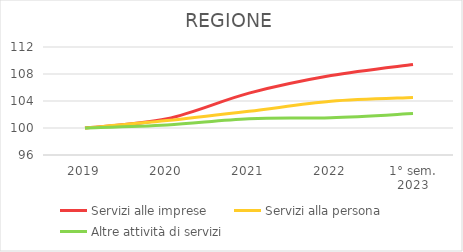
| Category | Servizi alle imprese | Servizi alla persona | Altre attività di servizi |
|---|---|---|---|
| 2019 | 100 | 100 | 100 |
| 2020 | 101.369 | 101.095 | 100.456 |
| 2021 | 105.169 | 102.473 | 101.378 |
| 2022 | 107.773 | 103.959 | 101.525 |
| 1° sem.
2023 | 109.41 | 104.519 | 102.137 |